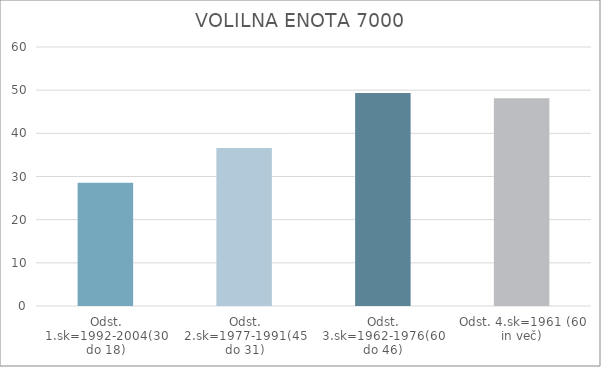
| Category | Series 0 |
|---|---|
| Odst. 1.sk=1992-2004(30 do 18) | 28.56 |
| Odst. 2.sk=1977-1991(45 do 31) | 36.6 |
| Odst. 3.sk=1962-1976(60 do 46) | 49.35 |
| Odst. 4.sk=1961 (60 in več) | 48.11 |